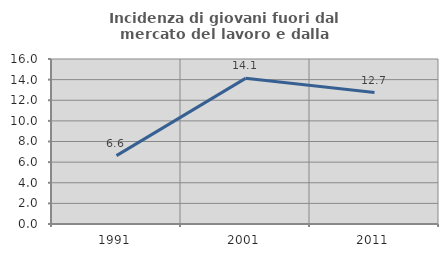
| Category | Incidenza di giovani fuori dal mercato del lavoro e dalla formazione  |
|---|---|
| 1991.0 | 6.633 |
| 2001.0 | 14.124 |
| 2011.0 | 12.745 |